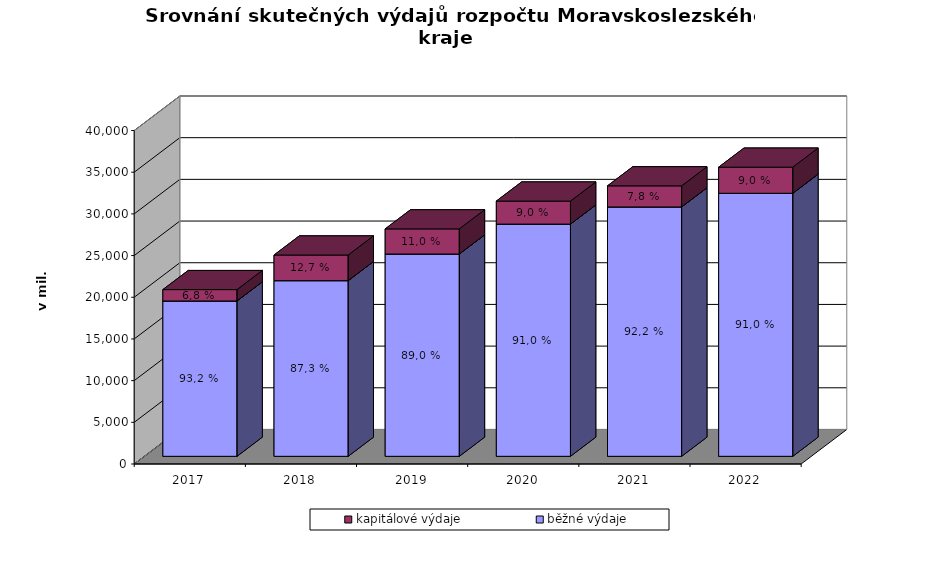
| Category | běžné výdaje | kapitálové výdaje |
|---|---|---|
| 2017.0 | 18636.111 | 1361.573 |
| 2018.0 | 21071.9 | 3075.103 |
| 2019.0 | 24267.163 | 3013.68 |
| 2020.0 | 27856.287 | 2762.403 |
| 2021.0 | 29914.915 | 2528.19 |
| 2022.0 | 31551.644 | 3132.273 |